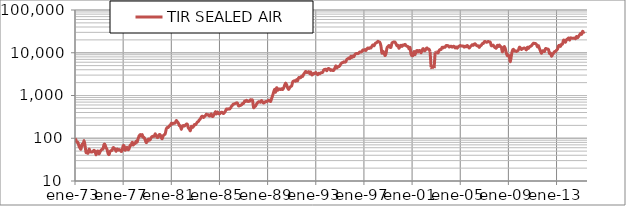
| Category | TIR SEALED AIR |
|---|---|
| 26666.0 | 100 |
| 26697.0 | 89.84 |
| 26725.0 | 80.47 |
| 26756.0 | 79.69 |
| 26786.0 | 65.63 |
| 26817.0 | 59.38 |
| 26847.0 | 55.47 |
| 26878.0 | 71.88 |
| 26909.0 | 68.75 |
| 26939.0 | 88.28 |
| 26970.0 | 67.97 |
| 27000.0 | 46.88 |
| 27031.0 | 47.66 |
| 27062.0 | 44.53 |
| 27090.0 | 55.47 |
| 27121.0 | 50.78 |
| 27151.0 | 47.66 |
| 27182.0 | 47.66 |
| 27212.0 | 49.22 |
| 27243.0 | 52.34 |
| 27274.0 | 49.22 |
| 27304.0 | 40.63 |
| 27335.0 | 48.44 |
| 27365.0 | 50 |
| 27396.0 | 42.97 |
| 27427.0 | 48.44 |
| 27455.0 | 52.34 |
| 27486.0 | 55.47 |
| 27516.0 | 56.25 |
| 27547.0 | 71.42 |
| 27577.0 | 70.63 |
| 27608.0 | 59.64 |
| 27639.0 | 54.94 |
| 27669.0 | 43.95 |
| 27700.0 | 41.59 |
| 27730.0 | 48.99 |
| 27761.0 | 51.36 |
| 27792.0 | 52.15 |
| 27821.0 | 60.05 |
| 27852.0 | 58.77 |
| 27882.0 | 55.6 |
| 27913.0 | 49.24 |
| 27943.0 | 55.95 |
| 27974.0 | 52.76 |
| 28005.0 | 54.36 |
| 28035.0 | 53.07 |
| 28066.0 | 49.05 |
| 28096.0 | 51.46 |
| 28127.0 | 66.34 |
| 28158.0 | 65.54 |
| 28186.0 | 52.59 |
| 28217.0 | 57 |
| 28247.0 | 61.07 |
| 28278.0 | 53.74 |
| 28308.0 | 57.34 |
| 28339.0 | 68.8 |
| 28370.0 | 69.26 |
| 28400.0 | 80.8 |
| 28431.0 | 69.26 |
| 28461.0 | 77.51 |
| 28492.0 | 75.48 |
| 28523.0 | 85.43 |
| 28551.0 | 81.28 |
| 28582.0 | 98.5 |
| 28612.0 | 113.53 |
| 28643.0 | 121.87 |
| 28673.0 | 111.51 |
| 28704.0 | 121.57 |
| 28735.0 | 105.48 |
| 28765.0 | 103.79 |
| 28796.0 | 91.13 |
| 28826.0 | 79.32 |
| 28857.0 | 84.25 |
| 28888.0 | 95.31 |
| 28916.0 | 90.2 |
| 28947.0 | 92.61 |
| 28977.0 | 103.76 |
| 29008.0 | 109.76 |
| 29038.0 | 111.29 |
| 29069.0 | 111.29 |
| 29100.0 | 127.58 |
| 29130.0 | 114.56 |
| 29161.0 | 104.14 |
| 29191.0 | 106.64 |
| 29222.0 | 121.5 |
| 29253.0 | 119.75 |
| 29282.0 | 103.99 |
| 29313.0 | 97.82 |
| 29343.0 | 114.56 |
| 29374.0 | 120.69 |
| 29404.0 | 127.79 |
| 29435.0 | 164.18 |
| 29466.0 | 178.44 |
| 29496.0 | 179.33 |
| 29527.0 | 195.39 |
| 29557.0 | 199 |
| 29588.0 | 224.1 |
| 29619.0 | 214.24 |
| 29647.0 | 225.1 |
| 29678.0 | 223.3 |
| 29708.0 | 228.7 |
| 29739.0 | 259.39 |
| 29769.0 | 243.12 |
| 29800.0 | 226.86 |
| 29831.0 | 198.09 |
| 29861.0 | 194.46 |
| 29892.0 | 160.84 |
| 29922.0 | 191.92 |
| 29953.0 | 198.32 |
| 29984.0 | 192.83 |
| 30012.0 | 203.1 |
| 30043.0 | 213.21 |
| 30073.0 | 212.29 |
| 30104.0 | 174.79 |
| 30134.0 | 165.54 |
| 30165.0 | 149.82 |
| 30196.0 | 188.88 |
| 30226.0 | 178.65 |
| 30257.0 | 186.09 |
| 30287.0 | 207.84 |
| 30318.0 | 205.96 |
| 30349.0 | 220.01 |
| 30377.0 | 238.91 |
| 30408.0 | 246.44 |
| 30438.0 | 269.01 |
| 30469.0 | 285.17 |
| 30499.0 | 315.39 |
| 30530.0 | 328.61 |
| 30561.0 | 305.38 |
| 30591.0 | 322.45 |
| 30622.0 | 337.62 |
| 30652.0 | 365.54 |
| 30683.0 | 350.31 |
| 30714.0 | 356.02 |
| 30743.0 | 328.85 |
| 30774.0 | 344.15 |
| 30804.0 | 369.01 |
| 30835.0 | 322.63 |
| 30865.0 | 336.08 |
| 30896.0 | 368.73 |
| 30927.0 | 420.19 |
| 30957.0 | 370.08 |
| 30988.0 | 412.48 |
| 31018.0 | 379.33 |
| 31049.0 | 371.59 |
| 31080.0 | 389.01 |
| 31108.0 | 408.02 |
| 31139.0 | 400.25 |
| 31169.0 | 376.93 |
| 31200.0 | 397.92 |
| 31230.0 | 433.03 |
| 31261.0 | 483.74 |
| 31292.0 | 475.7 |
| 31322.0 | 487.45 |
| 31353.0 | 481.58 |
| 31383.0 | 506.79 |
| 31414.0 | 557.86 |
| 31445.0 | 595.19 |
| 31473.0 | 628.34 |
| 31504.0 | 636.22 |
| 31534.0 | 653.95 |
| 31565.0 | 669.63 |
| 31595.0 | 663.7 |
| 31626.0 | 574.81 |
| 31657.0 | 576.72 |
| 31687.0 | 588.61 |
| 31718.0 | 602.48 |
| 31748.0 | 648.02 |
| 31779.0 | 653.98 |
| 31810.0 | 735.48 |
| 31838.0 | 723.64 |
| 31869.0 | 773.47 |
| 31899.0 | 729.62 |
| 31930.0 | 729.68 |
| 31960.0 | 733.68 |
| 31991.0 | 793.65 |
| 32022.0 | 777.71 |
| 32052.0 | 771.69 |
| 32083.0 | 527.16 |
| 32113.0 | 545.25 |
| 32144.0 | 567.39 |
| 32175.0 | 629.76 |
| 32204.0 | 678.33 |
| 32235.0 | 712.66 |
| 32265.0 | 708.62 |
| 32296.0 | 698.81 |
| 32326.0 | 763.63 |
| 32357.0 | 706.91 |
| 32388.0 | 666.74 |
| 32418.0 | 687.07 |
| 32449.0 | 721.63 |
| 32479.0 | 718 |
| 32510.0 | 742.47 |
| 32541.0 | 777.15 |
| 32569.0 | 771.58 |
| 32600.0 | 724.51 |
| 32630.0 | 843.21 |
| 32661.0 | 988.53 |
| 32691.0 | 1186.23 |
| 32722.0 | 1401.13 |
| 32753.0 | 1194.83 |
| 32783.0 | 1521.47 |
| 32814.0 | 1332.36 |
| 32844.0 | 1409.72 |
| 32875.0 | 1418.32 |
| 32906.0 | 1375.34 |
| 32934.0 | 1444.11 |
| 32965.0 | 1375.34 |
| 32995.0 | 1495.68 |
| 33026.0 | 1736.37 |
| 33056.0 | 1951.26 |
| 33087.0 | 1779.35 |
| 33118.0 | 1495.68 |
| 33148.0 | 1383.94 |
| 33179.0 | 1530.07 |
| 33209.0 | 1616.02 |
| 33240.0 | 1684.79 |
| 33271.0 | 2080.2 |
| 33299.0 | 2166.16 |
| 33330.0 | 2217.74 |
| 33360.0 | 2157.56 |
| 33391.0 | 2355.27 |
| 33421.0 | 2217.74 |
| 33452.0 | 2604.55 |
| 33483.0 | 2630.34 |
| 33513.0 | 2613.15 |
| 33544.0 | 2853.83 |
| 33574.0 | 2810.85 |
| 33605.0 | 3154.69 |
| 33636.0 | 3403.97 |
| 33665.0 | 3661.84 |
| 33696.0 | 3455.54 |
| 33726.0 | 3489.92 |
| 33757.0 | 3610.27 |
| 33787.0 | 3232.05 |
| 33818.0 | 3550.1 |
| 33849.0 | 3042.94 |
| 33879.0 | 3111.71 |
| 33910.0 | 3300.81 |
| 33940.0 | 3266.43 |
| 33971.0 | 3455.54 |
| 34002.0 | 3232.05 |
| 34030.0 | 3060.13 |
| 34061.0 | 3300.81 |
| 34091.0 | 3214.86 |
| 34122.0 | 3386.77 |
| 34152.0 | 3421.16 |
| 34183.0 | 3507.12 |
| 34214.0 | 3988.48 |
| 34244.0 | 4074.44 |
| 34275.0 | 4108.82 |
| 34305.0 | 3782.18 |
| 34336.0 | 4211.98 |
| 34367.0 | 4263.55 |
| 34395.0 | 4108.82 |
| 34426.0 | 3868.14 |
| 34456.0 | 4005.68 |
| 34487.0 | 3850.95 |
| 34517.0 | 3885.33 |
| 34548.0 | 4332.32 |
| 34579.0 | 4951.22 |
| 34609.0 | 4401.09 |
| 34640.0 | 4727.73 |
| 34670.0 | 4727.73 |
| 34701.0 | 4985.61 |
| 34732.0 | 5484.16 |
| 34760.0 | 5793.62 |
| 34791.0 | 5896.77 |
| 34821.0 | 6120.26 |
| 34852.0 | 6017.11 |
| 34882.0 | 6171.84 |
| 34913.0 | 6997.04 |
| 34944.0 | 7168.96 |
| 34974.0 | 7529.98 |
| 35005.0 | 7289.3 |
| 35035.0 | 8286.42 |
| 35066.0 | 7736.28 |
| 35097.0 | 8355.18 |
| 35126.0 | 8080.12 |
| 35157.0 | 9008.47 |
| 35187.0 | 9489.84 |
| 35218.0 | 9627.37 |
| 35248.0 | 9524.22 |
| 35279.0 | 9902.44 |
| 35310.0 | 10418.19 |
| 35340.0 | 10349.43 |
| 35371.0 | 10762.03 |
| 35401.0 | 11621.61 |
| 35432.0 | 11415.31 |
| 35463.0 | 11862.3 |
| 35491.0 | 11243.39 |
| 35522.0 | 12309.28 |
| 35552.0 | 12996.95 |
| 35583.0 | 12549.97 |
| 35613.0 | 13048.53 |
| 35644.0 | 12928.19 |
| 35675.0 | 14269.14 |
| 35705.0 | 15266.26 |
| 35736.0 | 14509.82 |
| 35766.0 | 16039.89 |
| 35797.0 | 16985.44 |
| 35828.0 | 17466.8 |
| 35856.0 | 18515.5 |
| 35887.0 | 17981.18 |
| 35917.0 | 17398.04 |
| 35948.0 | 14372.29 |
| 35978.0 | 9833.67 |
| 36009.0 | 10830.79 |
| 36040.0 | 10039.97 |
| 36070.0 | 8595.87 |
| 36101.0 | 9575.8 |
| 36131.0 | 12859.42 |
| 36162.0 | 14045.65 |
| 36193.0 | 14784.89 |
| 36221.0 | 13564.28 |
| 36252.0 | 13443.94 |
| 36282.0 | 16779.14 |
| 36313.0 | 17557.06 |
| 36343.0 | 17862.21 |
| 36374.0 | 17759.06 |
| 36405.0 | 16211.81 |
| 36435.0 | 14561.4 |
| 36466.0 | 14836.47 |
| 36496.0 | 12670.31 |
| 36527.0 | 14355.1 |
| 36558.0 | 14956.81 |
| 36587.0 | 14028.46 |
| 36618.0 | 15197.5 |
| 36648.0 | 14939.62 |
| 36679.0 | 15713.25 |
| 36709.0 | 14784.89 |
| 36740.0 | 14148.8 |
| 36771.0 | 13873.73 |
| 36801.0 | 12309.28 |
| 36832.0 | 13272.02 |
| 36862.0 | 9163.2 |
| 36893.0 | 8561.48 |
| 36924.0 | 8730.65 |
| 36952.0 | 10724.89 |
| 36983.0 | 8953.45 |
| 37013.0 | 10653.38 |
| 37044.0 | 11341.04 |
| 37074.0 | 10361.8 |
| 37105.0 | 11272.28 |
| 37136.0 | 11052.22 |
| 37166.0 | 9951.95 |
| 37197.0 | 11456.57 |
| 37227.0 | 12543.09 |
| 37258.0 | 11247.52 |
| 37289.0 | 11277.78 |
| 37317.0 | 12471.57 |
| 37348.0 | 12950.19 |
| 37378.0 | 12108.48 |
| 37409.0 | 12023.21 |
| 37439.0 | 10653.38 |
| 37470.0 | 4632.14 |
| 37501.0 | 4260.8 |
| 37531.0 | 4775.17 |
| 37562.0 | 4373.58 |
| 37592.0 | 10078.48 |
| 37623.0 | 10480.08 |
| 37654.0 | 10375.55 |
| 37682.0 | 9943.7 |
| 37713.0 | 11277.78 |
| 37743.0 | 11907.68 |
| 37774.0 | 11959.95 |
| 37804.0 | 13368.29 |
| 37835.0 | 12991.45 |
| 37866.0 | 13563.59 |
| 37896.0 | 13453.56 |
| 37927.0 | 14724.38 |
| 37957.0 | 14672.11 |
| 37988.0 | 14589.59 |
| 38019.0 | 13621.35 |
| 38048.0 | 13962.44 |
| 38079.0 | 14248.51 |
| 38109.0 | 13519.58 |
| 38140.0 | 14066.96 |
| 38170.0 | 14044.96 |
| 38201.0 | 12947.44 |
| 38232.0 | 13646.11 |
| 38262.0 | 12804.4 |
| 38293.0 | 13808.4 |
| 38323.0 | 14226.5 |
| 38354.0 | 14771.14 |
| 38385.0 | 14344.78 |
| 38413.0 | 14375.04 |
| 38444.0 | 14311.78 |
| 38474.0 | 13519.58 |
| 38505.0 | 14276.02 |
| 38535.0 | 13764.39 |
| 38566.0 | 14837.15 |
| 38597.0 | 13750.64 |
| 38627.0 | 12859.42 |
| 38658.0 | 13907.43 |
| 38688.0 | 14531.83 |
| 38719.0 | 15450.56 |
| 38750.0 | 14878.41 |
| 38778.0 | 15907.38 |
| 38809.0 | 16147.32 |
| 38839.0 | 15060.71 |
| 38870.0 | 14487.73 |
| 38900.0 | 14493.26 |
| 38931.0 | 13342.65 |
| 38962.0 | 14599.11 |
| 38992.0 | 14915.34 |
| 39023.0 | 16357.77 |
| 39053.0 | 16449.04 |
| 39084.0 | 18053.62 |
| 39115.0 | 18295.55 |
| 39143.0 | 17585.22 |
| 39174.0 | 17774.91 |
| 39204.0 | 18360.71 |
| 39235.0 | 17953.33 |
| 39265.0 | 17611.95 |
| 39296.0 | 14634.66 |
| 39327.0 | 14802.55 |
| 39357.0 | 15023.16 |
| 39388.0 | 13663.55 |
| 39418.0 | 13084.87 |
| 39449.0 | 12870.04 |
| 39480.0 | 14901.25 |
| 39509.0 | 13970.28 |
| 39540.0 | 15194.52 |
| 39570.0 | 13907.53 |
| 39601.0 | 13539 |
| 39631.0 | 10496.24 |
| 39662.0 | 12370.97 |
| 39693.0 | 14074.76 |
| 39723.0 | 12413.36 |
| 39754.0 | 9699.37 |
| 39784.0 | 8525.6 |
| 39815.0 | 8801.07 |
| 39846.0 | 7791.11 |
| 39874.0 | 6192.49 |
| 39905.0 | 8545.39 |
| 39935.0 | 11170.25 |
| 39966.0 | 12091.87 |
| 39996.0 | 11020.13 |
| 40027.0 | 11119.88 |
| 40058.0 | 10697.38 |
| 40088.0 | 11093.14 |
| 40119.0 | 11607.04 |
| 40149.0 | 13449.99 |
| 40180.0 | 12980.87 |
| 40211.0 | 11947.63 |
| 40239.0 | 12339.55 |
| 40270.0 | 12739.05 |
| 40300.0 | 12948.08 |
| 40331.0 | 12398.63 |
| 40361.0 | 11707.81 |
| 40392.0 | 13407.82 |
| 40423.0 | 12604.2 |
| 40453.0 | 13740.7 |
| 40484.0 | 14115.49 |
| 40514.0 | 14576.13 |
| 40545.0 | 15658.09 |
| 40576.0 | 16746.13 |
| 40604.0 | 16442.21 |
| 40635.0 | 16430 |
| 40665.0 | 15745.93 |
| 40696.0 | 13756.09 |
| 40726.0 | 14658.83 |
| 40757.0 | 12601.55 |
| 40788.0 | 10977.41 |
| 40818.0 | 9653.93 |
| 40849.0 | 10977.41 |
| 40879.0 | 11102 |
| 40910.0 | 10721.96 |
| 40941.0 | 12472.62 |
| 40970.0 | 12404.71 |
| 41001.0 | 12178.95 |
| 41031.0 | 11884.19 |
| 41062.0 | 9649.21 |
| 41092.0 | 9826.26 |
| 41123.0 | 8315.01 |
| 41154.0 | 9103.66 |
| 41184.0 | 9792.66 |
| 41215.0 | 10634.77 |
| 41245.0 | 10632.8 |
| 41276.0 | 11532.79 |
| 41307.0 | 12265.65 |
| 41335.0 | 14472.71 |
| 41366.0 | 14905.98 |
| 41396.0 | 14078.23 |
| 41427.0 | 15856.6 |
| 41457.0 | 16028.48 |
| 41488.0 | 19741.36 |
| 41519.0 | 18466.89 |
| 41549.0 | 17712.59 |
| 41580.0 | 20383.84 |
| 41610.0 | 20775.72 |
| 41641.0 | 22119.39 |
| 41672.0 | 19693.02 |
| 41700.0 | 22158.74 |
| 41731.0 | 22018.55 |
| 41761.0 | 21853.99 |
| 41792.0 | 21807.91 |
| 41822.0 | 22160.21 |
| 41853.0 | 21380.34 |
| 41884.0 | 24116.49 |
| 41914.0 | 22332.83 |
| 41945.0 | 24103.8 |
| 41975.0 | 26199.79 |
| 42006.0 | 28414.58 |
| 42037.0 | 26950.6 |
| 42065.0 | 31615.38 |
| 42096.0 | 30088.74 |
| 42126.0 | 31316.57 |